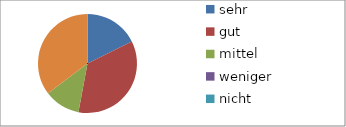
| Category | Series 0 |
|---|---|
| sehr | 3 |
| gut | 6 |
| mittel | 2 |
| weniger | 0 |
| nicht | 0 |
| kann ich nicht beurteilen | 6 |
| keine Angabe | 0 |